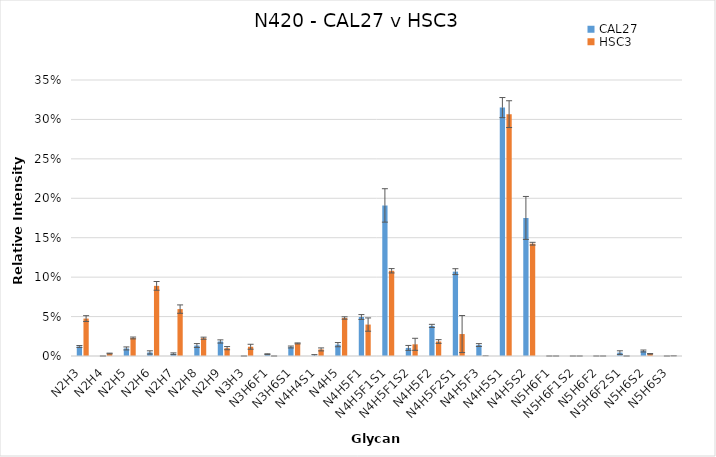
| Category | CAL27 | HSC3 |
|---|---|---|
| N2H3 | 0.012 | 0.047 |
| N2H4 | 0 | 0.003 |
| N2H5 | 0.01 | 0.023 |
| N2H6 | 0.005 | 0.089 |
| N2H7 | 0.003 | 0.059 |
| N2H8 | 0.013 | 0.023 |
| N2H9 | 0.018 | 0.01 |
| N3H3 | 0 | 0.012 |
| N3H6F1 | 0.002 | 0 |
| N3H6S1 | 0.011 | 0.016 |
| N4H4S1 | 0.001 | 0.008 |
| N4H5 | 0.014 | 0.048 |
| N4H5F1 | 0.049 | 0.04 |
| N4H5F1S1 | 0.191 | 0.108 |
| N4H5F1S2 | 0.01 | 0.015 |
| N4H5F2 | 0.038 | 0.018 |
| N4H5F2S1 | 0.107 | 0.028 |
| N4H5F3 | 0.014 | 0 |
| N4H5S1 | 0.315 | 0.307 |
| N4H5S2 | 0.175 | 0.142 |
| N5H6F1 | 0 | 0 |
| N5H6F1S2 | 0 | 0 |
| N5H6F2 | 0 | 0 |
| N5H6F2S1 | 0.004 | 0 |
| N5H6S2 | 0.006 | 0.003 |
| N5H6S3 | 0 | 0 |